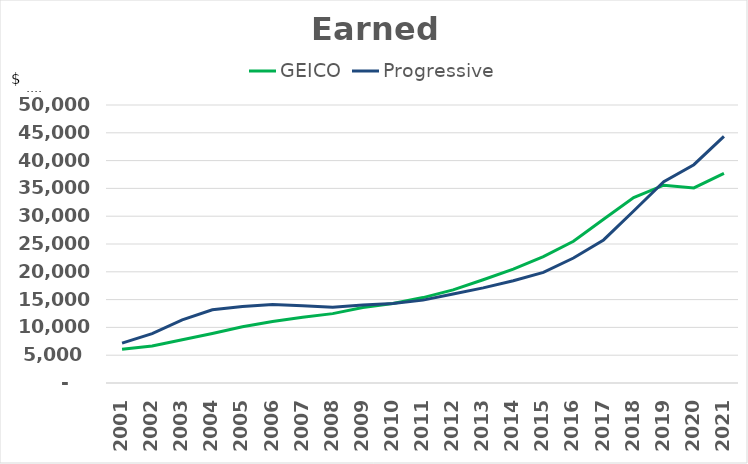
| Category | GEICO | Progressive |
|---|---|---|
| 2001.0 | 6060 | 7161.8 |
| 2002.0 | 6670 | 8883.5 |
| 2003.0 | 7784 | 11341 |
| 2004.0 | 8915 | 13169.9 |
| 2005.0 | 10101 | 13764.4 |
| 2006.0 | 11055 | 14117.9 |
| 2007.0 | 11806 | 13877.4 |
| 2008.0 | 12479 | 13631.4 |
| 2009.0 | 13576 | 14012.8 |
| 2010.0 | 14283 | 14314.8 |
| 2011.0 | 15363 | 14902.8 |
| 2012.0 | 16740 | 16018 |
| 2013.0 | 18572 | 17103.4 |
| 2014.0 | 20496 | 18398.5 |
| 2015.0 | 22718 | 19899.1 |
| 2016.0 | 25483 | 22474 |
| 2017.0 | 29441 | 25729.9 |
| 2018.0 | 33363 | 30933.3 |
| 2019.0 | 35572 | 36192.4 |
| 2020.0 | 35093 | 39261.6 |
| 2021.0 | 37706 | 44368.7 |